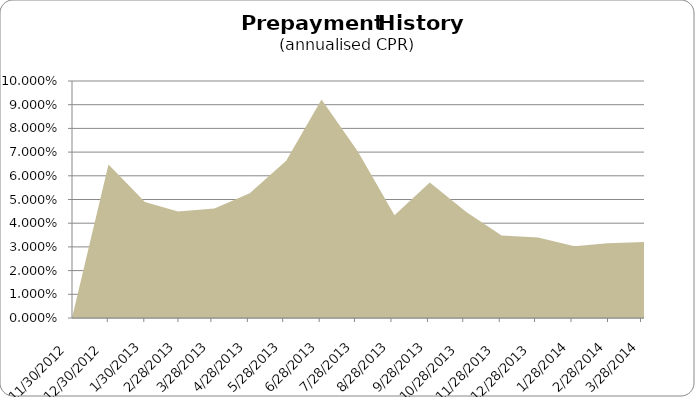
| Category | CPR |
|---|---|
| 11/30/12 | 0 |
| 12/31/12 | 0.065 |
| 1/31/13 | 0.049 |
| 2/28/13 | 0.045 |
| 3/31/13 | 0.046 |
| 4/30/13 | 0.053 |
| 5/31/13 | 0.066 |
| 6/30/13 | 0.092 |
| 7/31/13 | 0.07 |
| 8/31/13 | 0.043 |
| 9/30/13 | 0.057 |
| 10/31/13 | 0.045 |
| 11/30/13 | 0.035 |
| 12/31/13 | 0.034 |
| 1/31/14 | 0.03 |
| 2/28/14 | 0.032 |
| 3/31/14 | 0.032 |